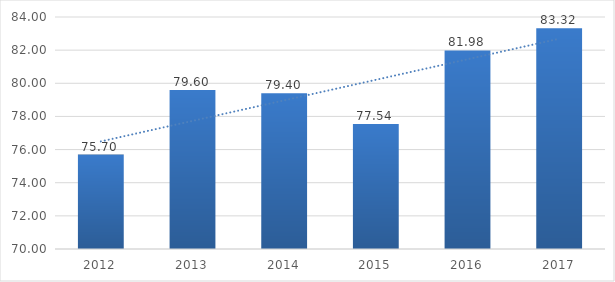
| Category | Series 0 |
|---|---|
| 2012.0 | 75.7 |
| 2013.0 | 79.6 |
| 2014.0 | 79.4 |
| 2015.0 | 77.54 |
| 2016.0 | 81.98 |
| 2017.0 | 83.32 |